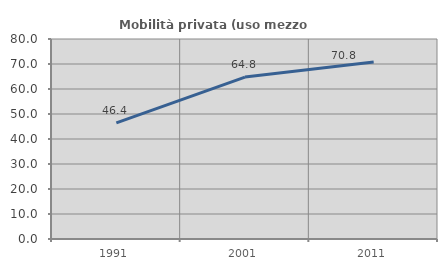
| Category | Mobilità privata (uso mezzo privato) |
|---|---|
| 1991.0 | 46.441 |
| 2001.0 | 64.777 |
| 2011.0 | 70.8 |